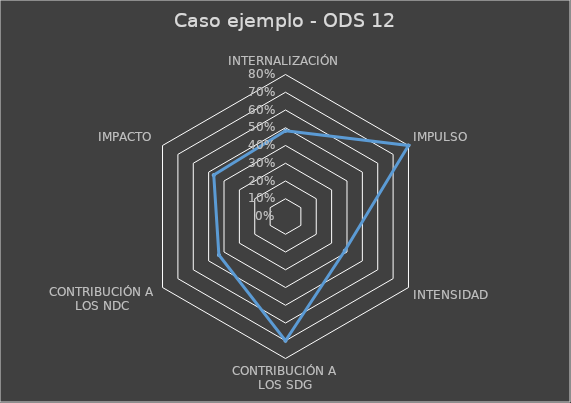
| Category | Series 0 |
|---|---|
| INTERNALIZACIÓN | 0.483 |
| IMPULSO | 0.8 |
| INTENSIDAD | 0.386 |
| CONTRIBUCIÓN A LOS SDG | 0.7 |
| CONTRIBUCIÓN A LOS NDC | 0.433 |
| IMPACTO | 0.467 |